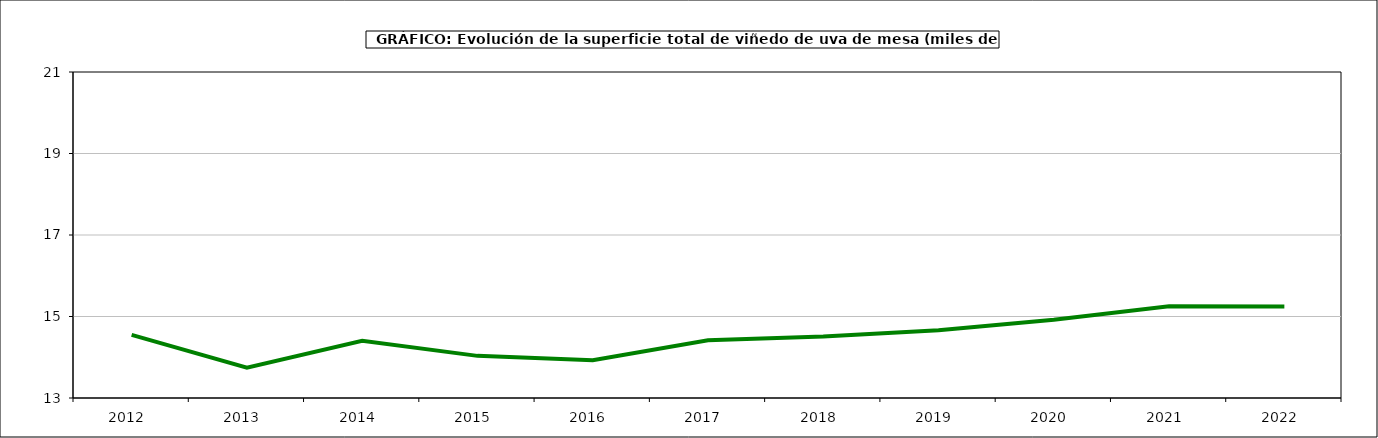
| Category | superficie |
|---|---|
| 2012.0 | 14.548 |
| 2013.0 | 13.742 |
| 2014.0 | 14.403 |
| 2015.0 | 14.034 |
| 2016.0 | 13.925 |
| 2017.0 | 14.416 |
| 2018.0 | 14.509 |
| 2019.0 | 14.665 |
| 2020.0 | 14.92 |
| 2021.0 | 15.249 |
| 2022.0 | 15.246 |